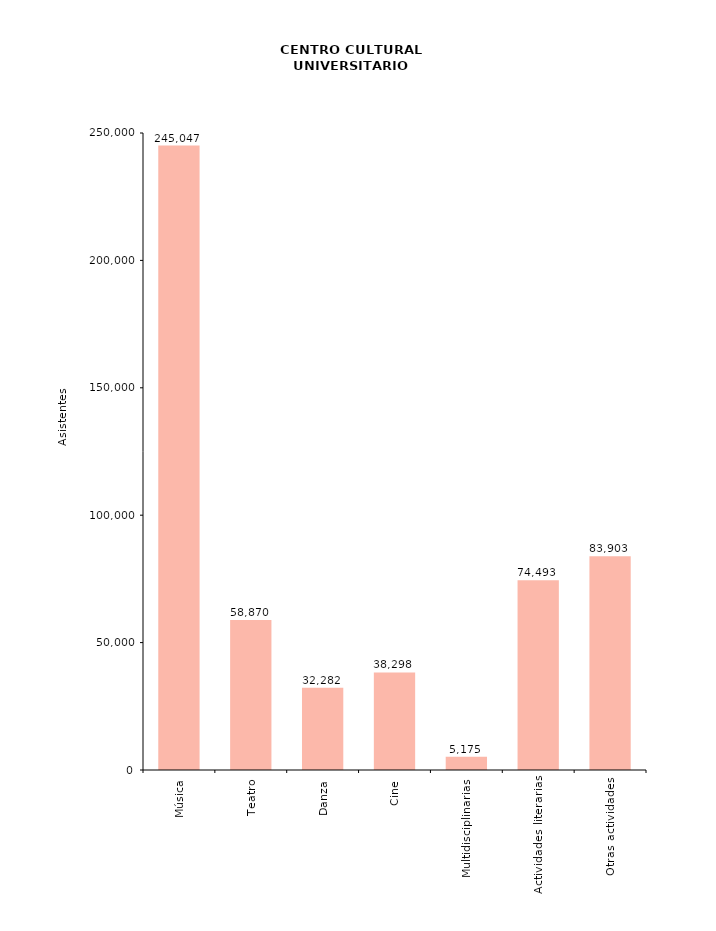
| Category | Series 0 |
|---|---|
| Música | 245047 |
| Teatro | 58870 |
| Danza | 32282 |
| Cine | 38298 |
| Multidisciplinarias | 5175 |
| Actividades literarias | 74493 |
| Otras actividades | 83903 |